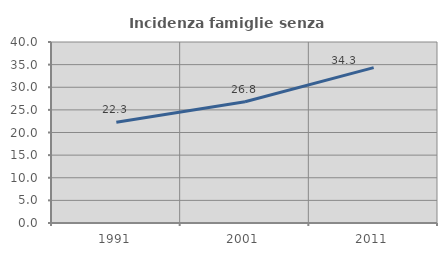
| Category | Incidenza famiglie senza nuclei |
|---|---|
| 1991.0 | 22.265 |
| 2001.0 | 26.796 |
| 2011.0 | 34.328 |